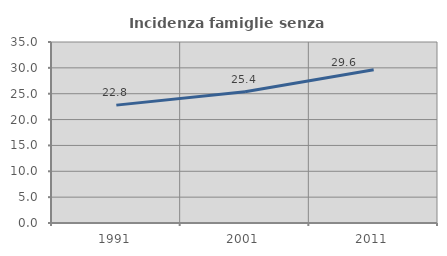
| Category | Incidenza famiglie senza nuclei |
|---|---|
| 1991.0 | 22.793 |
| 2001.0 | 25.383 |
| 2011.0 | 29.621 |